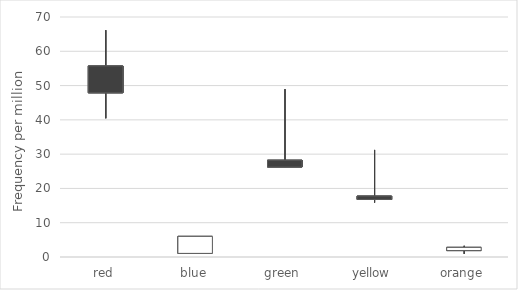
| Category | open | high | low | close |
|---|---|---|---|---|
| red | 55.73 | 66.16 | 40.45 | 47.88 |
| blue | 1.05 | 6.02 | 1.05 | 6.02 |
| green | 28.23 | 48.96 | 26.23 | 26.23 |
| yellow | 17.77 | 31.23 | 15.86 | 16.79 |
| orange | 1.87 | 3.27 | 0.9 | 2.81 |